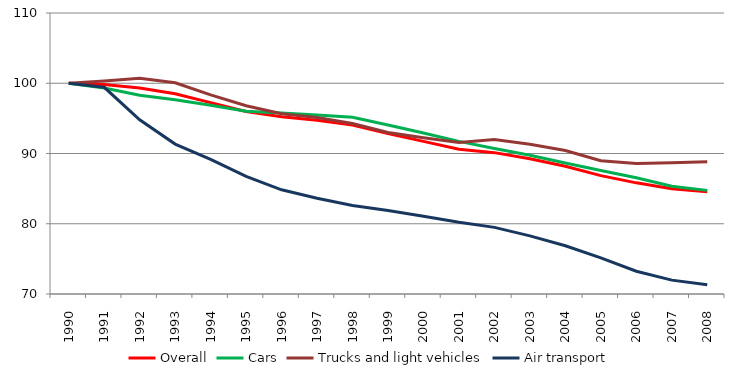
| Category | Overall | Cars | Trucks and light vehicles | Air transport |
|---|---|---|---|---|
| 1990.0 | 100 | 100 | 100 | 100 |
| 1991.0 | 99.813 | 99.317 | 100.329 | 99.423 |
| 1992.0 | 99.324 | 98.293 | 100.705 | 94.794 |
| 1993.0 | 98.5 | 97.664 | 100.069 | 91.341 |
| 1994.0 | 97.239 | 96.874 | 98.347 | 89.163 |
| 1995.0 | 95.992 | 96.027 | 96.801 | 86.73 |
| 1996.0 | 95.229 | 95.78 | 95.66 | 84.833 |
| 1997.0 | 94.747 | 95.495 | 95.136 | 83.632 |
| 1998.0 | 94.044 | 95.156 | 94.266 | 82.6 |
| 1999.0 | 92.848 | 94.055 | 92.991 | 81.886 |
| 2000.0 | 91.724 | 92.911 | 92.254 | 81.066 |
| 2001.0 | 90.611 | 91.723 | 91.564 | 80.213 |
| 2002.0 | 90.121 | 90.707 | 91.99 | 79.485 |
| 2003.0 | 89.24 | 89.753 | 91.325 | 78.272 |
| 2004.0 | 88.177 | 88.64 | 90.432 | 76.874 |
| 2005.0 | 86.85 | 87.584 | 88.959 | 75.155 |
| 2006.0 | 85.822 | 86.544 | 88.567 | 73.244 |
| 2007.0 | 84.988 | 85.329 | 88.678 | 71.973 |
| 2008.0 | 84.569 | 84.75 | 88.84 | 71.304 |